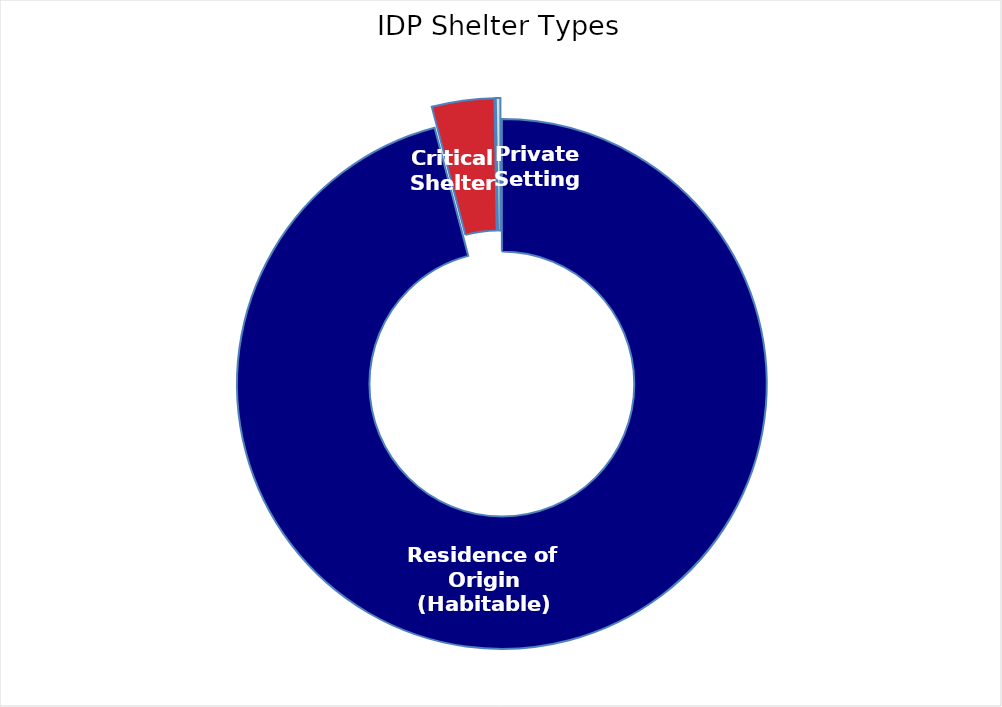
| Category | Individuals |
|---|---|
| Residence of Origin (Habitable) | 4766694 |
| Critical Shelter | 189162 |
| Private Setting | 13878 |